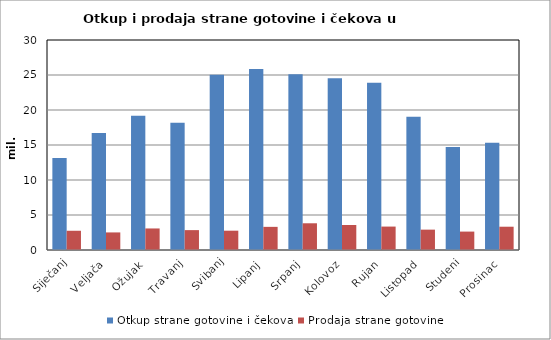
| Category | Otkup strane gotovine i čekova  | Prodaja strane gotovine  |
|---|---|---|
| Siječanj | 13138984 | 2747586 |
| Veljača | 16718670 | 2511086 |
| Ožujak | 19174283 | 3077494 |
| Travanj | 18189298 | 2839470 |
| Svibanj | 25033467 | 2759093 |
| Lipanj | 25858666 | 3306301 |
| Srpanj | 25116795 | 3817588 |
| Kolovoz | 24552327 | 3568360 |
| Rujan | 23896158 | 3346413 |
| Listopad | 19046107 | 2908772 |
| Studeni | 14719191 | 2629865 |
| Prosinac | 15328327 | 3326989 |